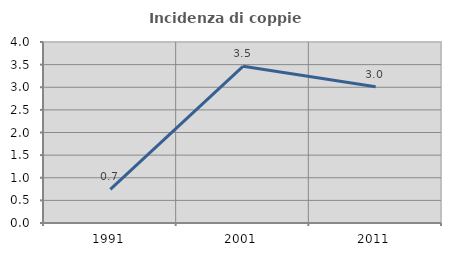
| Category | Incidenza di coppie miste |
|---|---|
| 1991.0 | 0.745 |
| 2001.0 | 3.462 |
| 2011.0 | 3.012 |